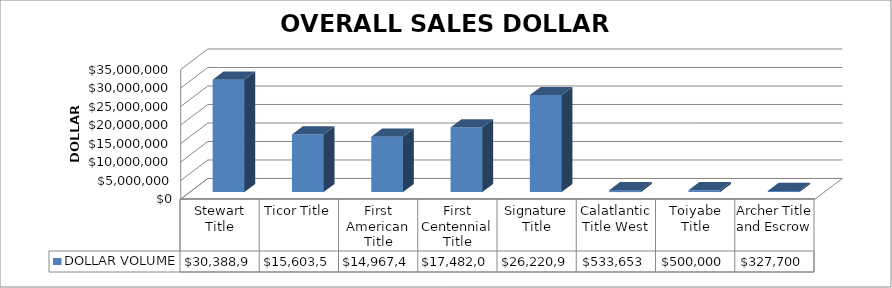
| Category | DOLLAR VOLUME |
|---|---|
| Stewart Title | 30388931 |
| Ticor Title | 15603500 |
| First American Title | 14967400 |
| First Centennial Title | 17482000 |
| Signature Title | 26220904 |
| Calatlantic Title West | 533653 |
| Toiyabe Title | 500000 |
| Archer Title and Escrow | 327700 |